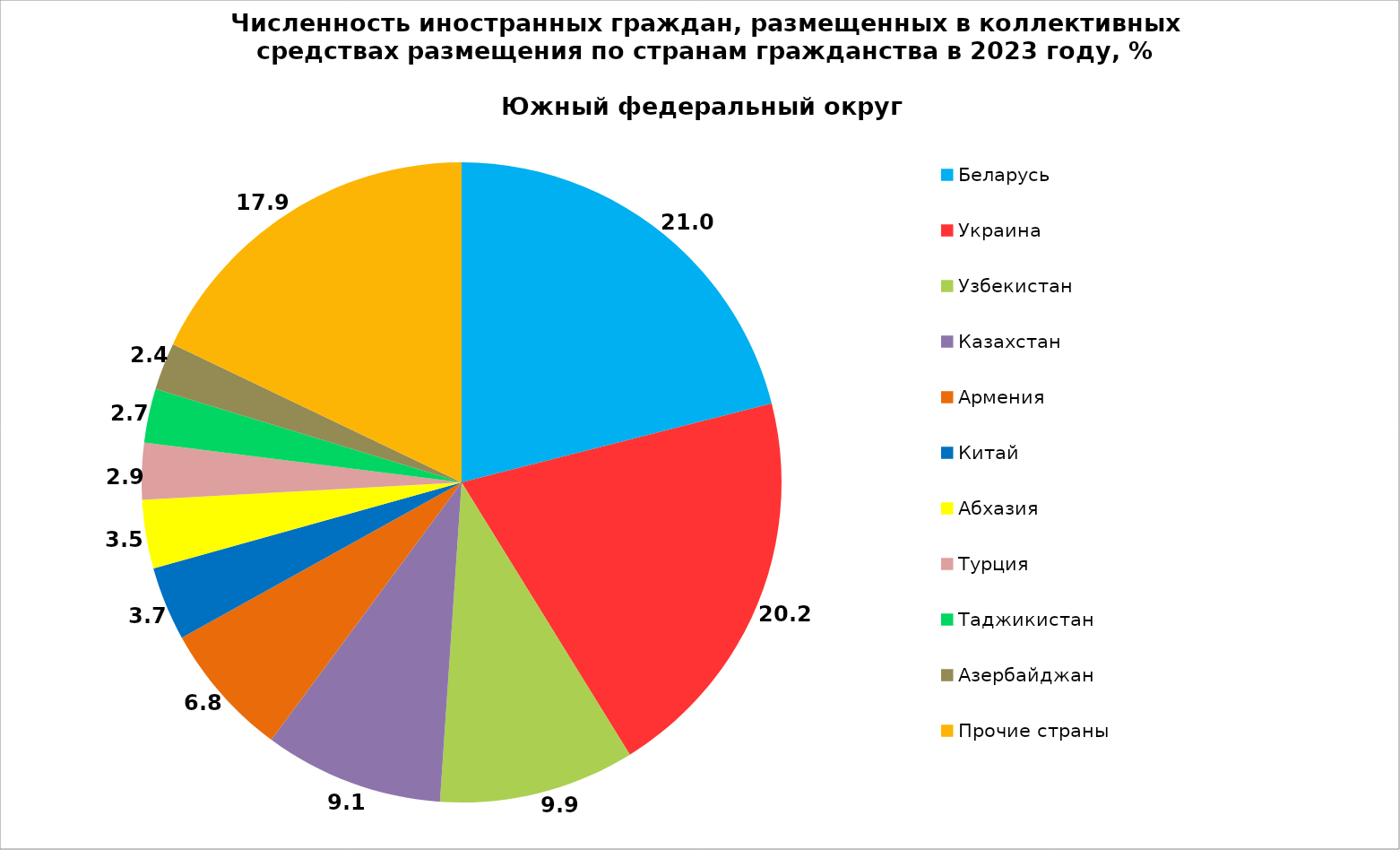
| Category | Series 0 |
|---|---|
| Беларусь | 21.032 |
| Украина | 20.153 |
| Узбекистан | 9.895 |
| Казахстан | 9.054 |
| Армения | 6.806 |
| Китай | 3.725 |
| Абхазия | 3.461 |
| Турция | 2.862 |
| Таджикистан | 2.722 |
| Азербайджан | 2.387 |
| Прочие страны | 17.903 |